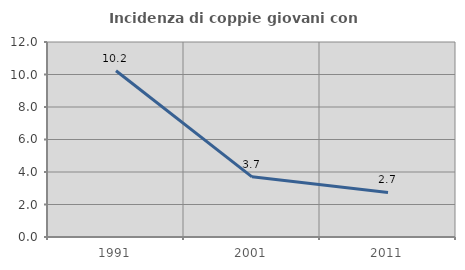
| Category | Incidenza di coppie giovani con figli |
|---|---|
| 1991.0 | 10.227 |
| 2001.0 | 3.704 |
| 2011.0 | 2.74 |